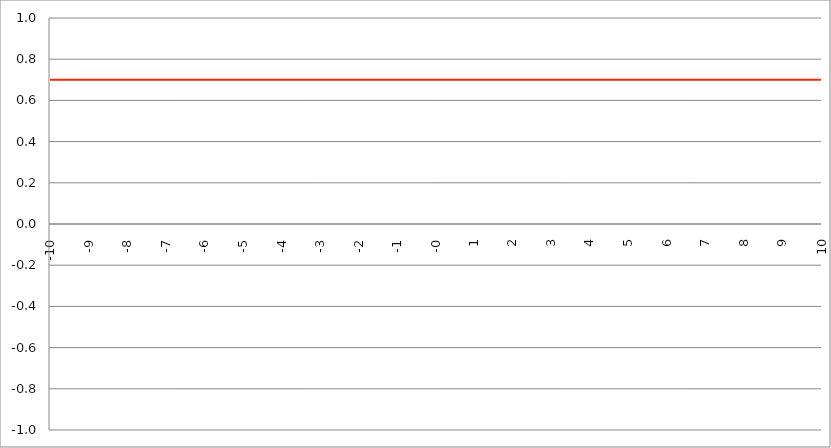
| Category | Series 1 |
|---|---|
| -10.0 | 0.7 |
| -9.99 | 0.7 |
| -9.98 | 0.7 |
| -9.97 | 0.7 |
| -9.96 | 0.7 |
| -9.95 | 0.7 |
| -9.940000000000001 | 0.7 |
| -9.930000000000001 | 0.7 |
| -9.920000000000002 | 0.7 |
| -9.91 | 0.7 |
| -9.900000000000002 | 0.7 |
| -9.890000000000002 | 0.7 |
| -9.880000000000003 | 0.7 |
| -9.870000000000003 | 0.7 |
| -9.860000000000001 | 0.7 |
| -9.850000000000003 | 0.7 |
| -9.840000000000003 | 0.7 |
| -9.830000000000004 | 0.7 |
| -9.820000000000004 | 0.7 |
| -9.810000000000004 | 0.7 |
| -9.800000000000004 | 0.7 |
| -9.790000000000004 | 0.7 |
| -9.780000000000005 | 0.7 |
| -9.770000000000005 | 0.7 |
| -9.760000000000005 | 0.7 |
| -9.750000000000005 | 0.7 |
| -9.740000000000006 | 0.7 |
| -9.730000000000006 | 0.7 |
| -9.720000000000006 | 0.7 |
| -9.710000000000006 | 0.7 |
| -9.700000000000006 | 0.7 |
| -9.690000000000007 | 0.7 |
| -9.680000000000007 | 0.7 |
| -9.670000000000007 | 0.7 |
| -9.660000000000007 | 0.7 |
| -9.650000000000007 | 0.7 |
| -9.640000000000008 | 0.7 |
| -9.630000000000008 | 0.7 |
| -9.620000000000008 | 0.7 |
| -9.610000000000008 | 0.7 |
| -9.600000000000009 | 0.7 |
| -9.590000000000009 | 0.7 |
| -9.580000000000007 | 0.7 |
| -9.57000000000001 | 0.7 |
| -9.56000000000001 | 0.7 |
| -9.55000000000001 | 0.7 |
| -9.54000000000001 | 0.7 |
| -9.53000000000001 | 0.7 |
| -9.52000000000001 | 0.7 |
| -9.51000000000001 | 0.7 |
| -9.50000000000001 | 0.7 |
| -9.49000000000001 | 0.7 |
| -9.48000000000001 | 0.7 |
| -9.47000000000001 | 0.7 |
| -9.46000000000001 | 0.7 |
| -9.45000000000001 | 0.7 |
| -9.44000000000001 | 0.7 |
| -9.430000000000012 | 0.7 |
| -9.420000000000012 | 0.7 |
| -9.410000000000013 | 0.7 |
| -9.400000000000013 | 0.7 |
| -9.390000000000011 | 0.7 |
| -9.380000000000013 | 0.7 |
| -9.370000000000013 | 0.7 |
| -9.360000000000014 | 0.7 |
| -9.350000000000014 | 0.7 |
| -9.340000000000014 | 0.7 |
| -9.330000000000014 | 0.7 |
| -9.320000000000014 | 0.7 |
| -9.310000000000015 | 0.7 |
| -9.300000000000013 | 0.7 |
| -9.290000000000015 | 0.7 |
| -9.280000000000015 | 0.7 |
| -9.270000000000016 | 0.7 |
| -9.260000000000016 | 0.7 |
| -9.250000000000014 | 0.7 |
| -9.240000000000016 | 0.7 |
| -9.230000000000016 | 0.7 |
| -9.220000000000017 | 0.7 |
| -9.210000000000017 | 0.7 |
| -9.200000000000017 | 0.7 |
| -9.190000000000017 | 0.7 |
| -9.180000000000017 | 0.7 |
| -9.170000000000018 | 0.7 |
| -9.160000000000016 | 0.7 |
| -9.150000000000018 | 0.7 |
| -9.140000000000018 | 0.7 |
| -9.130000000000019 | 0.7 |
| -9.120000000000019 | 0.7 |
| -9.110000000000017 | 0.7 |
| -9.10000000000002 | 0.7 |
| -9.09000000000002 | 0.7 |
| -9.08000000000002 | 0.7 |
| -9.07000000000002 | 0.7 |
| -9.06000000000002 | 0.7 |
| -9.05000000000002 | 0.7 |
| -9.04000000000002 | 0.7 |
| -9.03000000000002 | 0.7 |
| -9.020000000000021 | 0.7 |
| -9.010000000000021 | 0.7 |
| -9.000000000000021 | 0.7 |
| -8.990000000000022 | 0.7 |
| -8.980000000000022 | 0.7 |
| -8.97000000000002 | 0.7 |
| -8.960000000000022 | 0.7 |
| -8.950000000000022 | 0.7 |
| -8.940000000000023 | 0.7 |
| -8.930000000000023 | 0.7 |
| -8.920000000000023 | 0.7 |
| -8.910000000000023 | 0.7 |
| -8.900000000000023 | 0.7 |
| -8.890000000000024 | 0.7 |
| -8.880000000000024 | 0.7 |
| -8.870000000000024 | 0.7 |
| -8.860000000000024 | 0.7 |
| -8.850000000000025 | 0.7 |
| -8.840000000000025 | 0.7 |
| -8.830000000000025 | 0.7 |
| -8.820000000000025 | 0.7 |
| -8.810000000000025 | 0.7 |
| -8.800000000000026 | 0.7 |
| -8.790000000000026 | 0.7 |
| -8.780000000000026 | 0.7 |
| -8.770000000000026 | 0.7 |
| -8.760000000000026 | 0.7 |
| -8.750000000000027 | 0.7 |
| -8.740000000000027 | 0.7 |
| -8.730000000000027 | 0.7 |
| -8.720000000000027 | 0.7 |
| -8.710000000000027 | 0.7 |
| -8.700000000000028 | 0.7 |
| -8.690000000000028 | 0.7 |
| -8.680000000000028 | 0.7 |
| -8.670000000000028 | 0.7 |
| -8.660000000000029 | 0.7 |
| -8.650000000000029 | 0.7 |
| -8.640000000000029 | 0.7 |
| -8.63000000000003 | 0.7 |
| -8.62000000000003 | 0.7 |
| -8.61000000000003 | 0.7 |
| -8.60000000000003 | 0.7 |
| -8.59000000000003 | 0.7 |
| -8.58000000000003 | 0.7 |
| -8.57000000000003 | 0.7 |
| -8.56000000000003 | 0.7 |
| -8.55000000000003 | 0.7 |
| -8.540000000000031 | 0.7 |
| -8.530000000000031 | 0.7 |
| -8.520000000000032 | 0.7 |
| -8.510000000000032 | 0.7 |
| -8.50000000000003 | 0.7 |
| -8.490000000000032 | 0.7 |
| -8.480000000000032 | 0.7 |
| -8.470000000000033 | 0.7 |
| -8.460000000000033 | 0.7 |
| -8.450000000000033 | 0.7 |
| -8.440000000000033 | 0.7 |
| -8.430000000000033 | 0.7 |
| -8.420000000000034 | 0.7 |
| -8.410000000000032 | 0.7 |
| -8.400000000000034 | 0.7 |
| -8.390000000000034 | 0.7 |
| -8.380000000000035 | 0.7 |
| -8.370000000000035 | 0.7 |
| -8.360000000000033 | 0.7 |
| -8.350000000000035 | 0.7 |
| -8.340000000000035 | 0.7 |
| -8.330000000000036 | 0.7 |
| -8.320000000000036 | 0.7 |
| -8.310000000000034 | 0.7 |
| -8.300000000000036 | 0.7 |
| -8.290000000000036 | 0.7 |
| -8.280000000000037 | 0.7 |
| -8.270000000000037 | 0.7 |
| -8.260000000000037 | 0.7 |
| -8.250000000000037 | 0.7 |
| -8.240000000000038 | 0.7 |
| -8.230000000000038 | 0.7 |
| -8.220000000000038 | 0.7 |
| -8.210000000000038 | 0.7 |
| -8.200000000000038 | 0.7 |
| -8.190000000000039 | 0.7 |
| -8.180000000000039 | 0.7 |
| -8.170000000000037 | 0.7 |
| -8.16000000000004 | 0.7 |
| -8.15000000000004 | 0.7 |
| -8.14000000000004 | 0.7 |
| -8.13000000000004 | 0.7 |
| -8.12000000000004 | 0.7 |
| -8.11000000000004 | 0.7 |
| -8.10000000000004 | 0.7 |
| -8.09000000000004 | 0.7 |
| -8.08000000000004 | 0.7 |
| -8.07000000000004 | 0.7 |
| -8.06000000000004 | 0.7 |
| -8.05000000000004 | 0.7 |
| -8.040000000000042 | 0.7 |
| -8.03000000000004 | 0.7 |
| -8.020000000000042 | 0.7 |
| -8.010000000000042 | 0.7 |
| -8.000000000000043 | 0.7 |
| -7.990000000000043 | 0.7 |
| -7.980000000000043 | 0.7 |
| -7.970000000000043 | 0.7 |
| -7.960000000000043 | 0.7 |
| -7.950000000000044 | 0.7 |
| -7.940000000000044 | 0.7 |
| -7.930000000000044 | 0.7 |
| -7.920000000000044 | 0.7 |
| -7.910000000000044 | 0.7 |
| -7.900000000000044 | 0.7 |
| -7.890000000000045 | 0.7 |
| -7.880000000000045 | 0.7 |
| -7.870000000000045 | 0.7 |
| -7.860000000000046 | 0.7 |
| -7.850000000000046 | 0.7 |
| -7.840000000000046 | 0.7 |
| -7.830000000000046 | 0.7 |
| -7.820000000000046 | 0.7 |
| -7.810000000000047 | 0.7 |
| -7.800000000000047 | 0.7 |
| -7.790000000000047 | 0.7 |
| -7.780000000000047 | 0.7 |
| -7.770000000000047 | 0.7 |
| -7.760000000000048 | 0.7 |
| -7.750000000000048 | 0.7 |
| -7.740000000000048 | 0.7 |
| -7.730000000000048 | 0.7 |
| -7.720000000000049 | 0.7 |
| -7.710000000000049 | 0.7 |
| -7.700000000000049 | 0.7 |
| -7.690000000000049 | 0.7 |
| -7.680000000000049 | 0.7 |
| -7.67000000000005 | 0.7 |
| -7.66000000000005 | 0.7 |
| -7.65000000000005 | 0.7 |
| -7.64000000000005 | 0.7 |
| -7.63000000000005 | 0.7 |
| -7.620000000000051 | 0.7 |
| -7.610000000000051 | 0.7 |
| -7.600000000000051 | 0.7 |
| -7.590000000000051 | 0.7 |
| -7.580000000000052 | 0.7 |
| -7.570000000000052 | 0.7 |
| -7.560000000000052 | 0.7 |
| -7.550000000000052 | 0.7 |
| -7.540000000000052 | 0.7 |
| -7.530000000000053 | 0.7 |
| -7.520000000000053 | 0.7 |
| -7.510000000000053 | 0.7 |
| -7.500000000000053 | 0.7 |
| -7.490000000000053 | 0.7 |
| -7.480000000000054 | 0.7 |
| -7.470000000000054 | 0.7 |
| -7.460000000000054 | 0.7 |
| -7.450000000000054 | 0.7 |
| -7.440000000000054 | 0.7 |
| -7.430000000000054 | 0.7 |
| -7.420000000000055 | 0.7 |
| -7.410000000000055 | 0.7 |
| -7.400000000000055 | 0.7 |
| -7.390000000000056 | 0.7 |
| -7.380000000000056 | 0.7 |
| -7.370000000000056 | 0.7 |
| -7.360000000000056 | 0.7 |
| -7.350000000000056 | 0.7 |
| -7.340000000000057 | 0.7 |
| -7.330000000000057 | 0.7 |
| -7.320000000000057 | 0.7 |
| -7.310000000000057 | 0.7 |
| -7.300000000000058 | 0.7 |
| -7.290000000000058 | 0.7 |
| -7.280000000000058 | 0.7 |
| -7.270000000000058 | 0.7 |
| -7.260000000000058 | 0.7 |
| -7.250000000000059 | 0.7 |
| -7.240000000000059 | 0.7 |
| -7.23000000000006 | 0.7 |
| -7.220000000000059 | 0.7 |
| -7.210000000000059 | 0.7 |
| -7.20000000000006 | 0.7 |
| -7.19000000000006 | 0.7 |
| -7.18000000000006 | 0.7 |
| -7.17000000000006 | 0.7 |
| -7.160000000000061 | 0.7 |
| -7.150000000000061 | 0.7 |
| -7.140000000000061 | 0.7 |
| -7.130000000000061 | 0.7 |
| -7.120000000000061 | 0.7 |
| -7.110000000000062 | 0.7 |
| -7.100000000000062 | 0.7 |
| -7.090000000000062 | 0.7 |
| -7.080000000000062 | 0.7 |
| -7.070000000000062 | 0.7 |
| -7.060000000000063 | 0.7 |
| -7.050000000000063 | 0.7 |
| -7.040000000000063 | 0.7 |
| -7.030000000000063 | 0.7 |
| -7.020000000000064 | 0.7 |
| -7.010000000000064 | 0.7 |
| -7.000000000000064 | 0.7 |
| -6.990000000000064 | 0.7 |
| -6.980000000000064 | 0.7 |
| -6.970000000000064 | 0.7 |
| -6.960000000000064 | 0.7 |
| -6.950000000000064 | 0.7 |
| -6.940000000000065 | 0.7 |
| -6.930000000000065 | 0.7 |
| -6.920000000000065 | 0.7 |
| -6.910000000000065 | 0.7 |
| -6.900000000000066 | 0.7 |
| -6.890000000000066 | 0.7 |
| -6.880000000000066 | 0.7 |
| -6.870000000000066 | 0.7 |
| -6.860000000000067 | 0.7 |
| -6.850000000000067 | 0.7 |
| -6.840000000000067 | 0.7 |
| -6.830000000000067 | 0.7 |
| -6.820000000000068 | 0.7 |
| -6.810000000000068 | 0.7 |
| -6.800000000000068 | 0.7 |
| -6.790000000000068 | 0.7 |
| -6.780000000000068 | 0.7 |
| -6.770000000000068 | 0.7 |
| -6.760000000000069 | 0.7 |
| -6.75000000000007 | 0.7 |
| -6.74000000000007 | 0.7 |
| -6.73000000000007 | 0.7 |
| -6.72000000000007 | 0.7 |
| -6.71000000000007 | 0.7 |
| -6.70000000000007 | 0.7 |
| -6.69000000000007 | 0.7 |
| -6.680000000000071 | 0.7 |
| -6.670000000000071 | 0.7 |
| -6.660000000000071 | 0.7 |
| -6.650000000000071 | 0.7 |
| -6.640000000000072 | 0.7 |
| -6.630000000000072 | 0.7 |
| -6.620000000000072 | 0.7 |
| -6.610000000000072 | 0.7 |
| -6.600000000000072 | 0.7 |
| -6.590000000000073 | 0.7 |
| -6.580000000000073 | 0.7 |
| -6.570000000000073 | 0.7 |
| -6.560000000000073 | 0.7 |
| -6.550000000000074 | 0.7 |
| -6.540000000000074 | 0.7 |
| -6.530000000000074 | 0.7 |
| -6.520000000000074 | 0.7 |
| -6.510000000000074 | 0.7 |
| -6.500000000000074 | 0.7 |
| -6.490000000000074 | 0.7 |
| -6.480000000000074 | 0.7 |
| -6.470000000000075 | 0.7 |
| -6.460000000000075 | 0.7 |
| -6.450000000000075 | 0.7 |
| -6.440000000000075 | 0.7 |
| -6.430000000000076 | 0.7 |
| -6.420000000000076 | 0.7 |
| -6.410000000000076 | 0.7 |
| -6.400000000000076 | 0.7 |
| -6.390000000000077 | 0.7 |
| -6.380000000000077 | 0.7 |
| -6.370000000000077 | 0.7 |
| -6.360000000000078 | 0.7 |
| -6.350000000000078 | 0.7 |
| -6.340000000000078 | 0.7 |
| -6.330000000000078 | 0.7 |
| -6.320000000000078 | 0.7 |
| -6.310000000000079 | 0.7 |
| -6.300000000000079 | 0.7 |
| -6.29000000000008 | 0.7 |
| -6.28000000000008 | 0.7 |
| -6.27000000000008 | 0.7 |
| -6.26000000000008 | 0.7 |
| -6.25000000000008 | 0.7 |
| -6.24000000000008 | 0.7 |
| -6.23000000000008 | 0.7 |
| -6.220000000000081 | 0.7 |
| -6.210000000000081 | 0.7 |
| -6.200000000000081 | 0.7 |
| -6.190000000000081 | 0.7 |
| -6.180000000000081 | 0.7 |
| -6.170000000000082 | 0.7 |
| -6.160000000000082 | 0.7 |
| -6.150000000000082 | 0.7 |
| -6.140000000000082 | 0.7 |
| -6.130000000000082 | 0.7 |
| -6.120000000000083 | 0.7 |
| -6.110000000000083 | 0.7 |
| -6.100000000000083 | 0.7 |
| -6.090000000000083 | 0.7 |
| -6.080000000000084 | 0.7 |
| -6.070000000000084 | 0.7 |
| -6.060000000000084 | 0.7 |
| -6.050000000000084 | 0.7 |
| -6.040000000000084 | 0.7 |
| -6.030000000000084 | 0.7 |
| -6.020000000000085 | 0.7 |
| -6.010000000000085 | 0.7 |
| -6.000000000000085 | 0.7 |
| -5.990000000000085 | 0.7 |
| -5.980000000000085 | 0.7 |
| -5.970000000000085 | 0.7 |
| -5.960000000000086 | 0.7 |
| -5.950000000000086 | 0.7 |
| -5.940000000000086 | 0.7 |
| -5.930000000000086 | 0.7 |
| -5.920000000000087 | 0.7 |
| -5.910000000000087 | 0.7 |
| -5.900000000000087 | 0.7 |
| -5.890000000000088 | 0.7 |
| -5.880000000000088 | 0.7 |
| -5.870000000000088 | 0.7 |
| -5.860000000000088 | 0.7 |
| -5.850000000000088 | 0.7 |
| -5.840000000000089 | 0.7 |
| -5.830000000000089 | 0.7 |
| -5.820000000000089 | 0.7 |
| -5.810000000000089 | 0.7 |
| -5.800000000000089 | 0.7 |
| -5.79000000000009 | 0.7 |
| -5.78000000000009 | 0.7 |
| -5.77000000000009 | 0.7 |
| -5.76000000000009 | 0.7 |
| -5.750000000000091 | 0.7 |
| -5.740000000000091 | 0.7 |
| -5.730000000000091 | 0.7 |
| -5.720000000000091 | 0.7 |
| -5.710000000000091 | 0.7 |
| -5.700000000000092 | 0.7 |
| -5.690000000000092 | 0.7 |
| -5.680000000000092 | 0.7 |
| -5.670000000000092 | 0.7 |
| -5.660000000000092 | 0.7 |
| -5.650000000000093 | 0.7 |
| -5.640000000000093 | 0.7 |
| -5.630000000000093 | 0.7 |
| -5.620000000000093 | 0.7 |
| -5.610000000000093 | 0.7 |
| -5.600000000000094 | 0.7 |
| -5.590000000000094 | 0.7 |
| -5.580000000000094 | 0.7 |
| -5.570000000000094 | 0.7 |
| -5.560000000000095 | 0.7 |
| -5.550000000000095 | 0.7 |
| -5.540000000000095 | 0.7 |
| -5.530000000000095 | 0.7 |
| -5.520000000000095 | 0.7 |
| -5.510000000000096 | 0.7 |
| -5.500000000000096 | 0.7 |
| -5.490000000000096 | 0.7 |
| -5.480000000000096 | 0.7 |
| -5.470000000000096 | 0.7 |
| -5.460000000000097 | 0.7 |
| -5.450000000000097 | 0.7 |
| -5.440000000000097 | 0.7 |
| -5.430000000000097 | 0.7 |
| -5.420000000000098 | 0.7 |
| -5.410000000000098 | 0.7 |
| -5.400000000000098 | 0.7 |
| -5.390000000000098 | 0.7 |
| -5.380000000000098 | 0.7 |
| -5.370000000000099 | 0.7 |
| -5.360000000000099 | 0.7 |
| -5.350000000000099 | 0.7 |
| -5.340000000000099 | 0.7 |
| -5.330000000000099 | 0.7 |
| -5.3200000000001 | 0.7 |
| -5.3100000000001 | 0.7 |
| -5.3000000000001 | 0.7 |
| -5.2900000000001 | 0.7 |
| -5.2800000000001 | 0.7 |
| -5.2700000000001 | 0.7 |
| -5.260000000000101 | 0.7 |
| -5.250000000000101 | 0.7 |
| -5.240000000000101 | 0.7 |
| -5.230000000000101 | 0.7 |
| -5.220000000000102 | 0.7 |
| -5.210000000000102 | 0.7 |
| -5.200000000000102 | 0.7 |
| -5.190000000000103 | 0.7 |
| -5.180000000000103 | 0.7 |
| -5.170000000000103 | 0.7 |
| -5.160000000000103 | 0.7 |
| -5.150000000000103 | 0.7 |
| -5.140000000000104 | 0.7 |
| -5.130000000000104 | 0.7 |
| -5.120000000000104 | 0.7 |
| -5.110000000000104 | 0.7 |
| -5.100000000000104 | 0.7 |
| -5.090000000000104 | 0.7 |
| -5.080000000000104 | 0.7 |
| -5.070000000000105 | 0.7 |
| -5.060000000000105 | 0.7 |
| -5.050000000000105 | 0.7 |
| -5.040000000000105 | 0.7 |
| -5.030000000000105 | 0.7 |
| -5.020000000000106 | 0.7 |
| -5.010000000000106 | 0.7 |
| -5.000000000000106 | 0.7 |
| -4.990000000000106 | 0.7 |
| -4.980000000000106 | 0.7 |
| -4.970000000000107 | 0.7 |
| -4.960000000000107 | 0.7 |
| -4.950000000000107 | 0.7 |
| -4.940000000000107 | 0.7 |
| -4.930000000000108 | 0.7 |
| -4.920000000000108 | 0.7 |
| -4.910000000000108 | 0.7 |
| -4.900000000000108 | 0.7 |
| -4.890000000000109 | 0.7 |
| -4.88000000000011 | 0.7 |
| -4.87000000000011 | 0.7 |
| -4.86000000000011 | 0.7 |
| -4.85000000000011 | 0.7 |
| -4.84000000000011 | 0.7 |
| -4.83000000000011 | 0.7 |
| -4.82000000000011 | 0.7 |
| -4.810000000000111 | 0.7 |
| -4.800000000000111 | 0.7 |
| -4.790000000000111 | 0.7 |
| -4.780000000000111 | 0.7 |
| -4.770000000000111 | 0.7 |
| -4.760000000000112 | 0.7 |
| -4.750000000000112 | 0.7 |
| -4.740000000000112 | 0.7 |
| -4.730000000000112 | 0.7 |
| -4.720000000000112 | 0.7 |
| -4.710000000000113 | 0.7 |
| -4.700000000000113 | 0.7 |
| -4.690000000000113 | 0.7 |
| -4.680000000000113 | 0.7 |
| -4.670000000000114 | 0.7 |
| -4.660000000000114 | 0.7 |
| -4.650000000000114 | 0.7 |
| -4.640000000000114 | 0.7 |
| -4.630000000000114 | 0.7 |
| -4.620000000000115 | 0.7 |
| -4.610000000000115 | 0.7 |
| -4.600000000000115 | 0.7 |
| -4.590000000000115 | 0.7 |
| -4.580000000000115 | 0.7 |
| -4.570000000000115 | 0.7 |
| -4.560000000000116 | 0.7 |
| -4.550000000000116 | 0.7 |
| -4.540000000000116 | 0.7 |
| -4.530000000000116 | 0.7 |
| -4.520000000000117 | 0.7 |
| -4.510000000000117 | 0.7 |
| -4.500000000000117 | 0.7 |
| -4.490000000000117 | 0.7 |
| -4.480000000000117 | 0.7 |
| -4.470000000000117 | 0.7 |
| -4.460000000000118 | 0.7 |
| -4.450000000000118 | 0.7 |
| -4.440000000000118 | 0.7 |
| -4.430000000000118 | 0.7 |
| -4.420000000000119 | 0.7 |
| -4.41000000000012 | 0.7 |
| -4.40000000000012 | 0.7 |
| -4.39000000000012 | 0.7 |
| -4.38000000000012 | 0.7 |
| -4.37000000000012 | 0.7 |
| -4.36000000000012 | 0.7 |
| -4.35000000000012 | 0.7 |
| -4.34000000000012 | 0.7 |
| -4.33000000000012 | 0.7 |
| -4.320000000000121 | 0.7 |
| -4.310000000000121 | 0.7 |
| -4.300000000000121 | 0.7 |
| -4.290000000000121 | 0.7 |
| -4.280000000000121 | 0.7 |
| -4.270000000000122 | 0.7 |
| -4.260000000000122 | 0.7 |
| -4.250000000000122 | 0.7 |
| -4.240000000000122 | 0.7 |
| -4.230000000000122 | 0.7 |
| -4.220000000000123 | 0.7 |
| -4.210000000000123 | 0.7 |
| -4.200000000000123 | 0.7 |
| -4.190000000000124 | 0.7 |
| -4.180000000000124 | 0.7 |
| -4.170000000000124 | 0.7 |
| -4.160000000000124 | 0.7 |
| -4.150000000000124 | 0.7 |
| -4.140000000000124 | 0.7 |
| -4.130000000000125 | 0.7 |
| -4.120000000000125 | 0.7 |
| -4.110000000000125 | 0.7 |
| -4.100000000000125 | 0.7 |
| -4.090000000000125 | 0.7 |
| -4.080000000000126 | 0.7 |
| -4.070000000000126 | 0.7 |
| -4.060000000000126 | 0.7 |
| -4.050000000000126 | 0.7 |
| -4.040000000000127 | 0.7 |
| -4.030000000000127 | 0.7 |
| -4.020000000000127 | 0.7 |
| -4.010000000000127 | 0.7 |
| -4.000000000000127 | 0.7 |
| -3.990000000000128 | 0.7 |
| -3.980000000000128 | 0.7 |
| -3.970000000000129 | 0.7 |
| -3.960000000000129 | 0.7 |
| -3.950000000000129 | 0.7 |
| -3.940000000000129 | 0.7 |
| -3.930000000000129 | 0.7 |
| -3.92000000000013 | 0.7 |
| -3.91000000000013 | 0.7 |
| -3.90000000000013 | 0.7 |
| -3.89000000000013 | 0.7 |
| -3.88000000000013 | 0.7 |
| -3.870000000000131 | 0.7 |
| -3.860000000000131 | 0.7 |
| -3.850000000000131 | 0.7 |
| -3.840000000000131 | 0.7 |
| -3.830000000000131 | 0.7 |
| -3.820000000000132 | 0.7 |
| -3.810000000000132 | 0.7 |
| -3.800000000000132 | 0.7 |
| -3.790000000000132 | 0.7 |
| -3.780000000000132 | 0.7 |
| -3.770000000000133 | 0.7 |
| -3.760000000000133 | 0.7 |
| -3.750000000000133 | 0.7 |
| -3.740000000000133 | 0.7 |
| -3.730000000000134 | 0.7 |
| -3.720000000000134 | 0.7 |
| -3.710000000000134 | 0.7 |
| -3.700000000000134 | 0.7 |
| -3.690000000000134 | 0.7 |
| -3.680000000000135 | 0.7 |
| -3.670000000000135 | 0.7 |
| -3.660000000000135 | 0.7 |
| -3.650000000000135 | 0.7 |
| -3.640000000000135 | 0.7 |
| -3.630000000000136 | 0.7 |
| -3.620000000000136 | 0.7 |
| -3.610000000000136 | 0.7 |
| -3.600000000000136 | 0.7 |
| -3.590000000000137 | 0.7 |
| -3.580000000000137 | 0.7 |
| -3.570000000000137 | 0.7 |
| -3.560000000000137 | 0.7 |
| -3.550000000000137 | 0.7 |
| -3.540000000000138 | 0.7 |
| -3.530000000000138 | 0.7 |
| -3.520000000000138 | 0.7 |
| -3.510000000000138 | 0.7 |
| -3.500000000000139 | 0.7 |
| -3.490000000000139 | 0.7 |
| -3.480000000000139 | 0.7 |
| -3.470000000000139 | 0.7 |
| -3.460000000000139 | 0.7 |
| -3.45000000000014 | 0.7 |
| -3.44000000000014 | 0.7 |
| -3.43000000000014 | 0.7 |
| -3.42000000000014 | 0.7 |
| -3.41000000000014 | 0.7 |
| -3.400000000000141 | 0.7 |
| -3.390000000000141 | 0.7 |
| -3.380000000000141 | 0.7 |
| -3.370000000000141 | 0.7 |
| -3.360000000000141 | 0.7 |
| -3.350000000000142 | 0.7 |
| -3.340000000000142 | 0.7 |
| -3.330000000000142 | 0.7 |
| -3.320000000000142 | 0.7 |
| -3.310000000000143 | 0.7 |
| -3.300000000000143 | 0.7 |
| -3.290000000000143 | 0.7 |
| -3.280000000000143 | 0.7 |
| -3.270000000000143 | 0.7 |
| -3.260000000000144 | 0.7 |
| -3.250000000000144 | 0.7 |
| -3.240000000000144 | 0.7 |
| -3.230000000000144 | 0.7 |
| -3.220000000000145 | 0.7 |
| -3.210000000000145 | 0.7 |
| -3.200000000000145 | 0.7 |
| -3.190000000000145 | 0.7 |
| -3.180000000000145 | 0.7 |
| -3.170000000000146 | 0.7 |
| -3.160000000000146 | 0.7 |
| -3.150000000000146 | 0.7 |
| -3.140000000000146 | 0.7 |
| -3.130000000000146 | 0.7 |
| -3.120000000000147 | 0.7 |
| -3.110000000000147 | 0.7 |
| -3.100000000000147 | 0.7 |
| -3.090000000000147 | 0.7 |
| -3.080000000000147 | 0.7 |
| -3.070000000000148 | 0.7 |
| -3.060000000000148 | 0.7 |
| -3.050000000000148 | 0.7 |
| -3.040000000000148 | 0.7 |
| -3.030000000000149 | 0.7 |
| -3.020000000000149 | 0.7 |
| -3.010000000000149 | 0.7 |
| -3.000000000000149 | 0.7 |
| -2.990000000000149 | 0.7 |
| -2.98000000000015 | 0.7 |
| -2.97000000000015 | 0.7 |
| -2.96000000000015 | 0.7 |
| -2.95000000000015 | 0.7 |
| -2.94000000000015 | 0.7 |
| -2.930000000000151 | 0.7 |
| -2.920000000000151 | 0.7 |
| -2.910000000000151 | 0.7 |
| -2.900000000000151 | 0.7 |
| -2.890000000000151 | 0.7 |
| -2.880000000000152 | 0.7 |
| -2.870000000000152 | 0.7 |
| -2.860000000000152 | 0.7 |
| -2.850000000000152 | 0.7 |
| -2.840000000000153 | 0.7 |
| -2.830000000000153 | 0.7 |
| -2.820000000000153 | 0.7 |
| -2.810000000000153 | 0.7 |
| -2.800000000000153 | 0.7 |
| -2.790000000000154 | 0.7 |
| -2.780000000000154 | 0.7 |
| -2.770000000000154 | 0.7 |
| -2.760000000000154 | 0.7 |
| -2.750000000000154 | 0.7 |
| -2.740000000000155 | 0.7 |
| -2.730000000000155 | 0.7 |
| -2.720000000000155 | 0.7 |
| -2.710000000000155 | 0.7 |
| -2.700000000000156 | 0.7 |
| -2.690000000000156 | 0.7 |
| -2.680000000000156 | 0.7 |
| -2.670000000000156 | 0.7 |
| -2.660000000000156 | 0.7 |
| -2.650000000000157 | 0.7 |
| -2.640000000000157 | 0.7 |
| -2.630000000000157 | 0.7 |
| -2.620000000000157 | 0.7 |
| -2.610000000000157 | 0.7 |
| -2.600000000000158 | 0.7 |
| -2.590000000000158 | 0.7 |
| -2.580000000000158 | 0.7 |
| -2.570000000000158 | 0.7 |
| -2.560000000000159 | 0.7 |
| -2.550000000000159 | 0.7 |
| -2.54000000000016 | 0.7 |
| -2.530000000000159 | 0.7 |
| -2.520000000000159 | 0.7 |
| -2.51000000000016 | 0.7 |
| -2.50000000000016 | 0.7 |
| -2.49000000000016 | 0.7 |
| -2.48000000000016 | 0.7 |
| -2.47000000000016 | 0.7 |
| -2.460000000000161 | 0.7 |
| -2.450000000000161 | 0.7 |
| -2.440000000000161 | 0.7 |
| -2.430000000000161 | 0.7 |
| -2.420000000000162 | 0.7 |
| -2.410000000000162 | 0.7 |
| -2.400000000000162 | 0.7 |
| -2.390000000000162 | 0.7 |
| -2.380000000000162 | 0.7 |
| -2.370000000000163 | 0.7 |
| -2.360000000000163 | 0.7 |
| -2.350000000000163 | 0.7 |
| -2.340000000000163 | 0.7 |
| -2.330000000000163 | 0.7 |
| -2.320000000000164 | 0.7 |
| -2.310000000000164 | 0.7 |
| -2.300000000000164 | 0.7 |
| -2.290000000000164 | 0.7 |
| -2.280000000000165 | 0.7 |
| -2.270000000000165 | 0.7 |
| -2.260000000000165 | 0.7 |
| -2.250000000000165 | 0.7 |
| -2.240000000000165 | 0.7 |
| -2.230000000000166 | 0.7 |
| -2.220000000000166 | 0.7 |
| -2.210000000000166 | 0.7 |
| -2.200000000000166 | 0.7 |
| -2.190000000000166 | 0.7 |
| -2.180000000000167 | 0.7 |
| -2.170000000000167 | 0.7 |
| -2.160000000000167 | 0.7 |
| -2.150000000000167 | 0.7 |
| -2.140000000000168 | 0.7 |
| -2.130000000000168 | 0.7 |
| -2.120000000000168 | 0.7 |
| -2.110000000000168 | 0.7 |
| -2.100000000000168 | 0.7 |
| -2.090000000000169 | 0.7 |
| -2.080000000000169 | 0.7 |
| -2.070000000000169 | 0.7 |
| -2.060000000000169 | 0.7 |
| -2.050000000000169 | 0.7 |
| -2.04000000000017 | 0.7 |
| -2.03000000000017 | 0.7 |
| -2.02000000000017 | 0.7 |
| -2.01000000000017 | 0.7 |
| -2.000000000000171 | 0.7 |
| -1.99000000000017 | 0.7 |
| -1.98000000000017 | 0.7 |
| -1.97000000000017 | 0.7 |
| -1.96000000000017 | 0.7 |
| -1.95000000000017 | 0.7 |
| -1.94000000000017 | 0.7 |
| -1.93000000000017 | 0.7 |
| -1.92000000000017 | 0.7 |
| -1.91000000000017 | 0.7 |
| -1.90000000000017 | 0.7 |
| -1.89000000000017 | 0.7 |
| -1.88000000000017 | 0.7 |
| -1.87000000000017 | 0.7 |
| -1.86000000000017 | 0.7 |
| -1.85000000000017 | 0.7 |
| -1.84000000000017 | 0.7 |
| -1.83000000000017 | 0.7 |
| -1.82000000000017 | 0.7 |
| -1.81000000000017 | 0.7 |
| -1.80000000000017 | 0.7 |
| -1.79000000000017 | 0.7 |
| -1.78000000000017 | 0.7 |
| -1.77000000000017 | 0.7 |
| -1.76000000000017 | 0.7 |
| -1.75000000000017 | 0.7 |
| -1.74000000000017 | 0.7 |
| -1.73000000000017 | 0.7 |
| -1.72000000000017 | 0.7 |
| -1.71000000000017 | 0.7 |
| -1.70000000000017 | 0.7 |
| -1.69000000000017 | 0.7 |
| -1.68000000000017 | 0.7 |
| -1.67000000000017 | 0.7 |
| -1.66000000000017 | 0.7 |
| -1.65000000000017 | 0.7 |
| -1.64000000000017 | 0.7 |
| -1.63000000000017 | 0.7 |
| -1.62000000000017 | 0.7 |
| -1.61000000000017 | 0.7 |
| -1.60000000000017 | 0.7 |
| -1.59000000000017 | 0.7 |
| -1.58000000000017 | 0.7 |
| -1.57000000000017 | 0.7 |
| -1.56000000000017 | 0.7 |
| -1.55000000000017 | 0.7 |
| -1.54000000000017 | 0.7 |
| -1.53000000000017 | 0.7 |
| -1.52000000000017 | 0.7 |
| -1.51000000000017 | 0.7 |
| -1.50000000000017 | 0.7 |
| -1.49000000000017 | 0.7 |
| -1.48000000000017 | 0.7 |
| -1.47000000000017 | 0.7 |
| -1.46000000000017 | 0.7 |
| -1.45000000000017 | 0.7 |
| -1.44000000000017 | 0.7 |
| -1.43000000000017 | 0.7 |
| -1.42000000000017 | 0.7 |
| -1.41000000000017 | 0.7 |
| -1.40000000000017 | 0.7 |
| -1.39000000000017 | 0.7 |
| -1.38000000000017 | 0.7 |
| -1.37000000000017 | 0.7 |
| -1.36000000000017 | 0.7 |
| -1.35000000000017 | 0.7 |
| -1.34000000000017 | 0.7 |
| -1.33000000000017 | 0.7 |
| -1.32000000000017 | 0.7 |
| -1.31000000000017 | 0.7 |
| -1.30000000000017 | 0.7 |
| -1.29000000000017 | 0.7 |
| -1.28000000000017 | 0.7 |
| -1.27000000000017 | 0.7 |
| -1.26000000000017 | 0.7 |
| -1.25000000000017 | 0.7 |
| -1.24000000000017 | 0.7 |
| -1.23000000000017 | 0.7 |
| -1.22000000000017 | 0.7 |
| -1.21000000000017 | 0.7 |
| -1.20000000000017 | 0.7 |
| -1.19000000000017 | 0.7 |
| -1.18000000000017 | 0.7 |
| -1.17000000000017 | 0.7 |
| -1.16000000000017 | 0.7 |
| -1.15000000000017 | 0.7 |
| -1.14000000000017 | 0.7 |
| -1.13000000000017 | 0.7 |
| -1.12000000000017 | 0.7 |
| -1.11000000000017 | 0.7 |
| -1.10000000000017 | 0.7 |
| -1.09000000000017 | 0.7 |
| -1.08000000000017 | 0.7 |
| -1.07000000000017 | 0.7 |
| -1.06000000000017 | 0.7 |
| -1.05000000000017 | 0.7 |
| -1.04000000000017 | 0.7 |
| -1.03000000000017 | 0.7 |
| -1.02000000000017 | 0.7 |
| -1.01000000000017 | 0.7 |
| -1.00000000000017 | 0.7 |
| -0.99000000000017 | 0.7 |
| -0.98000000000017 | 0.7 |
| -0.97000000000017 | 0.7 |
| -0.96000000000017 | 0.7 |
| -0.95000000000017 | 0.7 |
| -0.94000000000017 | 0.7 |
| -0.93000000000017 | 0.7 |
| -0.92000000000017 | 0.7 |
| -0.91000000000017 | 0.7 |
| -0.90000000000017 | 0.7 |
| -0.890000000000169 | 0.7 |
| -0.880000000000169 | 0.7 |
| -0.870000000000169 | 0.7 |
| -0.860000000000169 | 0.7 |
| -0.850000000000169 | 0.7 |
| -0.840000000000169 | 0.7 |
| -0.830000000000169 | 0.7 |
| -0.820000000000169 | 0.7 |
| -0.810000000000169 | 0.7 |
| -0.800000000000169 | 0.7 |
| -0.790000000000169 | 0.7 |
| -0.780000000000169 | 0.7 |
| -0.770000000000169 | 0.7 |
| -0.760000000000169 | 0.7 |
| -0.750000000000169 | 0.7 |
| -0.740000000000169 | 0.7 |
| -0.730000000000169 | 0.7 |
| -0.720000000000169 | 0.7 |
| -0.710000000000169 | 0.7 |
| -0.700000000000169 | 0.7 |
| -0.690000000000169 | 0.7 |
| -0.680000000000169 | 0.7 |
| -0.670000000000169 | 0.7 |
| -0.660000000000169 | 0.7 |
| -0.650000000000169 | 0.7 |
| -0.640000000000169 | 0.7 |
| -0.630000000000169 | 0.7 |
| -0.620000000000169 | 0.7 |
| -0.610000000000169 | 0.7 |
| -0.600000000000169 | 0.7 |
| -0.590000000000169 | 0.7 |
| -0.580000000000169 | 0.7 |
| -0.570000000000169 | 0.7 |
| -0.560000000000169 | 0.7 |
| -0.550000000000169 | 0.7 |
| -0.540000000000169 | 0.7 |
| -0.530000000000169 | 0.7 |
| -0.520000000000169 | 0.7 |
| -0.510000000000169 | 0.7 |
| -0.500000000000169 | 0.7 |
| -0.490000000000169 | 0.7 |
| -0.480000000000169 | 0.7 |
| -0.470000000000169 | 0.7 |
| -0.460000000000169 | 0.7 |
| -0.450000000000169 | 0.7 |
| -0.440000000000169 | 0.7 |
| -0.430000000000169 | 0.7 |
| -0.420000000000169 | 0.7 |
| -0.410000000000169 | 0.7 |
| -0.400000000000169 | 0.7 |
| -0.390000000000169 | 0.7 |
| -0.380000000000169 | 0.7 |
| -0.370000000000169 | 0.7 |
| -0.360000000000169 | 0.7 |
| -0.350000000000169 | 0.7 |
| -0.340000000000169 | 0.7 |
| -0.330000000000169 | 0.7 |
| -0.320000000000169 | 0.7 |
| -0.310000000000169 | 0.7 |
| -0.300000000000169 | 0.7 |
| -0.290000000000169 | 0.7 |
| -0.280000000000169 | 0.7 |
| -0.270000000000169 | 0.7 |
| -0.260000000000169 | 0.7 |
| -0.250000000000169 | 0.7 |
| -0.240000000000169 | 0.7 |
| -0.230000000000169 | 0.7 |
| -0.220000000000169 | 0.7 |
| -0.210000000000169 | 0.7 |
| -0.200000000000169 | 0.7 |
| -0.190000000000169 | 0.7 |
| -0.180000000000169 | 0.7 |
| -0.170000000000169 | 0.7 |
| -0.160000000000169 | 0.7 |
| -0.150000000000169 | 0.7 |
| -0.140000000000169 | 0.7 |
| -0.130000000000169 | 0.7 |
| -0.120000000000169 | 0.7 |
| -0.110000000000169 | 0.7 |
| -0.100000000000169 | 0.7 |
| -0.0900000000001689 | 0.7 |
| -0.0800000000001689 | 0.7 |
| -0.0700000000001689 | 0.7 |
| -0.0600000000001689 | 0.7 |
| -0.0500000000001689 | 0.7 |
| -0.0400000000001689 | 0.7 |
| -0.0300000000001689 | 0.7 |
| -0.0200000000001689 | 0.7 |
| -0.0100000000001689 | 0.7 |
| -1.6888920817415e-13 | 0.7 |
| 0.00999999999983111 | 0.7 |
| 0.0199999999998311 | 0.7 |
| 0.0299999999998311 | 0.7 |
| 0.0399999999998311 | 0.7 |
| 0.0499999999998311 | 0.7 |
| 0.0599999999998311 | 0.7 |
| 0.0699999999998311 | 0.7 |
| 0.0799999999998311 | 0.7 |
| 0.0899999999998311 | 0.7 |
| 0.0999999999998311 | 0.7 |
| 0.109999999999831 | 0.7 |
| 0.119999999999831 | 0.7 |
| 0.129999999999831 | 0.7 |
| 0.139999999999831 | 0.7 |
| 0.149999999999831 | 0.7 |
| 0.159999999999831 | 0.7 |
| 0.169999999999831 | 0.7 |
| 0.179999999999831 | 0.7 |
| 0.189999999999831 | 0.7 |
| 0.199999999999831 | 0.7 |
| 0.209999999999831 | 0.7 |
| 0.219999999999831 | 0.7 |
| 0.229999999999831 | 0.7 |
| 0.239999999999831 | 0.7 |
| 0.249999999999831 | 0.7 |
| 0.259999999999831 | 0.7 |
| 0.269999999999831 | 0.7 |
| 0.279999999999831 | 0.7 |
| 0.289999999999831 | 0.7 |
| 0.299999999999831 | 0.7 |
| 0.309999999999831 | 0.7 |
| 0.319999999999831 | 0.7 |
| 0.329999999999831 | 0.7 |
| 0.339999999999831 | 0.7 |
| 0.349999999999831 | 0.7 |
| 0.359999999999831 | 0.7 |
| 0.369999999999831 | 0.7 |
| 0.379999999999831 | 0.7 |
| 0.389999999999831 | 0.7 |
| 0.399999999999831 | 0.7 |
| 0.409999999999831 | 0.7 |
| 0.419999999999831 | 0.7 |
| 0.429999999999831 | 0.7 |
| 0.439999999999831 | 0.7 |
| 0.449999999999831 | 0.7 |
| 0.459999999999831 | 0.7 |
| 0.469999999999831 | 0.7 |
| 0.479999999999831 | 0.7 |
| 0.489999999999831 | 0.7 |
| 0.499999999999831 | 0.7 |
| 0.509999999999831 | 0.7 |
| 0.519999999999831 | 0.7 |
| 0.529999999999831 | 0.7 |
| 0.539999999999831 | 0.7 |
| 0.549999999999831 | 0.7 |
| 0.559999999999831 | 0.7 |
| 0.569999999999831 | 0.7 |
| 0.579999999999831 | 0.7 |
| 0.589999999999831 | 0.7 |
| 0.599999999999831 | 0.7 |
| 0.609999999999831 | 0.7 |
| 0.619999999999831 | 0.7 |
| 0.629999999999831 | 0.7 |
| 0.639999999999831 | 0.7 |
| 0.649999999999831 | 0.7 |
| 0.659999999999831 | 0.7 |
| 0.669999999999831 | 0.7 |
| 0.679999999999831 | 0.7 |
| 0.689999999999831 | 0.7 |
| 0.699999999999831 | 0.7 |
| 0.709999999999831 | 0.7 |
| 0.719999999999831 | 0.7 |
| 0.729999999999831 | 0.7 |
| 0.739999999999831 | 0.7 |
| 0.749999999999832 | 0.7 |
| 0.759999999999832 | 0.7 |
| 0.769999999999832 | 0.7 |
| 0.779999999999832 | 0.7 |
| 0.789999999999832 | 0.7 |
| 0.799999999999832 | 0.7 |
| 0.809999999999832 | 0.7 |
| 0.819999999999832 | 0.7 |
| 0.829999999999832 | 0.7 |
| 0.839999999999832 | 0.7 |
| 0.849999999999832 | 0.7 |
| 0.859999999999832 | 0.7 |
| 0.869999999999832 | 0.7 |
| 0.879999999999832 | 0.7 |
| 0.889999999999832 | 0.7 |
| 0.899999999999832 | 0.7 |
| 0.909999999999832 | 0.7 |
| 0.919999999999832 | 0.7 |
| 0.929999999999832 | 0.7 |
| 0.939999999999832 | 0.7 |
| 0.949999999999832 | 0.7 |
| 0.959999999999832 | 0.7 |
| 0.969999999999832 | 0.7 |
| 0.979999999999832 | 0.7 |
| 0.989999999999832 | 0.7 |
| 0.999999999999832 | 0.7 |
| 1.009999999999832 | 0.7 |
| 1.019999999999832 | 0.7 |
| 1.029999999999832 | 0.7 |
| 1.039999999999832 | 0.7 |
| 1.049999999999832 | 0.7 |
| 1.059999999999832 | 0.7 |
| 1.069999999999832 | 0.7 |
| 1.079999999999832 | 0.7 |
| 1.089999999999832 | 0.7 |
| 1.099999999999832 | 0.7 |
| 1.109999999999832 | 0.7 |
| 1.119999999999832 | 0.7 |
| 1.129999999999832 | 0.7 |
| 1.139999999999832 | 0.7 |
| 1.149999999999832 | 0.7 |
| 1.159999999999832 | 0.7 |
| 1.169999999999832 | 0.7 |
| 1.179999999999832 | 0.7 |
| 1.189999999999832 | 0.7 |
| 1.199999999999832 | 0.7 |
| 1.209999999999832 | 0.7 |
| 1.219999999999832 | 0.7 |
| 1.229999999999832 | 0.7 |
| 1.239999999999832 | 0.7 |
| 1.249999999999832 | 0.7 |
| 1.259999999999832 | 0.7 |
| 1.269999999999832 | 0.7 |
| 1.279999999999832 | 0.7 |
| 1.289999999999832 | 0.7 |
| 1.299999999999832 | 0.7 |
| 1.309999999999832 | 0.7 |
| 1.319999999999832 | 0.7 |
| 1.329999999999832 | 0.7 |
| 1.339999999999832 | 0.7 |
| 1.349999999999832 | 0.7 |
| 1.359999999999832 | 0.7 |
| 1.369999999999832 | 0.7 |
| 1.379999999999832 | 0.7 |
| 1.389999999999832 | 0.7 |
| 1.399999999999832 | 0.7 |
| 1.409999999999832 | 0.7 |
| 1.419999999999832 | 0.7 |
| 1.429999999999832 | 0.7 |
| 1.439999999999832 | 0.7 |
| 1.449999999999832 | 0.7 |
| 1.459999999999832 | 0.7 |
| 1.469999999999832 | 0.7 |
| 1.479999999999832 | 0.7 |
| 1.489999999999832 | 0.7 |
| 1.499999999999832 | 0.7 |
| 1.509999999999832 | 0.7 |
| 1.519999999999832 | 0.7 |
| 1.529999999999832 | 0.7 |
| 1.539999999999832 | 0.7 |
| 1.549999999999832 | 0.7 |
| 1.559999999999832 | 0.7 |
| 1.569999999999832 | 0.7 |
| 1.579999999999832 | 0.7 |
| 1.589999999999832 | 0.7 |
| 1.599999999999832 | 0.7 |
| 1.609999999999832 | 0.7 |
| 1.619999999999832 | 0.7 |
| 1.629999999999832 | 0.7 |
| 1.639999999999832 | 0.7 |
| 1.649999999999832 | 0.7 |
| 1.659999999999832 | 0.7 |
| 1.669999999999832 | 0.7 |
| 1.679999999999832 | 0.7 |
| 1.689999999999832 | 0.7 |
| 1.699999999999832 | 0.7 |
| 1.709999999999832 | 0.7 |
| 1.719999999999832 | 0.7 |
| 1.729999999999832 | 0.7 |
| 1.739999999999832 | 0.7 |
| 1.749999999999832 | 0.7 |
| 1.759999999999832 | 0.7 |
| 1.769999999999832 | 0.7 |
| 1.779999999999832 | 0.7 |
| 1.789999999999832 | 0.7 |
| 1.799999999999832 | 0.7 |
| 1.809999999999832 | 0.7 |
| 1.819999999999832 | 0.7 |
| 1.829999999999832 | 0.7 |
| 1.839999999999832 | 0.7 |
| 1.849999999999832 | 0.7 |
| 1.859999999999832 | 0.7 |
| 1.869999999999832 | 0.7 |
| 1.879999999999832 | 0.7 |
| 1.889999999999832 | 0.7 |
| 1.899999999999832 | 0.7 |
| 1.909999999999832 | 0.7 |
| 1.919999999999832 | 0.7 |
| 1.929999999999832 | 0.7 |
| 1.939999999999832 | 0.7 |
| 1.949999999999833 | 0.7 |
| 1.959999999999833 | 0.7 |
| 1.969999999999833 | 0.7 |
| 1.979999999999833 | 0.7 |
| 1.989999999999833 | 0.7 |
| 1.999999999999833 | 0.7 |
| 2.009999999999832 | 0.7 |
| 2.019999999999832 | 0.7 |
| 2.029999999999832 | 0.7 |
| 2.039999999999832 | 0.7 |
| 2.049999999999832 | 0.7 |
| 2.059999999999831 | 0.7 |
| 2.069999999999831 | 0.7 |
| 2.079999999999831 | 0.7 |
| 2.089999999999831 | 0.7 |
| 2.09999999999983 | 0.7 |
| 2.10999999999983 | 0.7 |
| 2.11999999999983 | 0.7 |
| 2.12999999999983 | 0.7 |
| 2.13999999999983 | 0.7 |
| 2.149999999999829 | 0.7 |
| 2.159999999999829 | 0.7 |
| 2.169999999999829 | 0.7 |
| 2.179999999999829 | 0.7 |
| 2.189999999999829 | 0.7 |
| 2.199999999999828 | 0.7 |
| 2.209999999999828 | 0.7 |
| 2.219999999999828 | 0.7 |
| 2.229999999999828 | 0.7 |
| 2.239999999999827 | 0.7 |
| 2.249999999999827 | 0.7 |
| 2.259999999999827 | 0.7 |
| 2.269999999999827 | 0.7 |
| 2.279999999999827 | 0.7 |
| 2.289999999999826 | 0.7 |
| 2.299999999999826 | 0.7 |
| 2.309999999999826 | 0.7 |
| 2.319999999999826 | 0.7 |
| 2.329999999999825 | 0.7 |
| 2.339999999999825 | 0.7 |
| 2.349999999999825 | 0.7 |
| 2.359999999999825 | 0.7 |
| 2.369999999999825 | 0.7 |
| 2.379999999999824 | 0.7 |
| 2.389999999999824 | 0.7 |
| 2.399999999999824 | 0.7 |
| 2.409999999999824 | 0.7 |
| 2.419999999999824 | 0.7 |
| 2.429999999999823 | 0.7 |
| 2.439999999999823 | 0.7 |
| 2.449999999999823 | 0.7 |
| 2.459999999999823 | 0.7 |
| 2.469999999999823 | 0.7 |
| 2.479999999999822 | 0.7 |
| 2.489999999999822 | 0.7 |
| 2.499999999999822 | 0.7 |
| 2.509999999999822 | 0.7 |
| 2.519999999999821 | 0.7 |
| 2.529999999999821 | 0.7 |
| 2.539999999999821 | 0.7 |
| 2.549999999999821 | 0.7 |
| 2.559999999999821 | 0.7 |
| 2.56999999999982 | 0.7 |
| 2.57999999999982 | 0.7 |
| 2.58999999999982 | 0.7 |
| 2.59999999999982 | 0.7 |
| 2.609999999999819 | 0.7 |
| 2.619999999999819 | 0.7 |
| 2.629999999999819 | 0.7 |
| 2.639999999999819 | 0.7 |
| 2.649999999999819 | 0.7 |
| 2.659999999999818 | 0.7 |
| 2.669999999999818 | 0.7 |
| 2.679999999999818 | 0.7 |
| 2.689999999999818 | 0.7 |
| 2.699999999999818 | 0.7 |
| 2.709999999999817 | 0.7 |
| 2.719999999999817 | 0.7 |
| 2.729999999999817 | 0.7 |
| 2.739999999999817 | 0.7 |
| 2.749999999999817 | 0.7 |
| 2.759999999999816 | 0.7 |
| 2.769999999999816 | 0.7 |
| 2.779999999999816 | 0.7 |
| 2.789999999999816 | 0.7 |
| 2.799999999999815 | 0.7 |
| 2.809999999999815 | 0.7 |
| 2.819999999999815 | 0.7 |
| 2.829999999999815 | 0.7 |
| 2.839999999999815 | 0.7 |
| 2.849999999999814 | 0.7 |
| 2.859999999999814 | 0.7 |
| 2.869999999999814 | 0.7 |
| 2.879999999999814 | 0.7 |
| 2.889999999999814 | 0.7 |
| 2.899999999999813 | 0.7 |
| 2.909999999999813 | 0.7 |
| 2.919999999999813 | 0.7 |
| 2.929999999999813 | 0.7 |
| 2.939999999999813 | 0.7 |
| 2.949999999999812 | 0.7 |
| 2.959999999999812 | 0.7 |
| 2.969999999999812 | 0.7 |
| 2.979999999999812 | 0.7 |
| 2.989999999999811 | 0.7 |
| 2.999999999999811 | 0.7 |
| 3.009999999999811 | 0.7 |
| 3.019999999999811 | 0.7 |
| 3.029999999999811 | 0.7 |
| 3.03999999999981 | 0.7 |
| 3.04999999999981 | 0.7 |
| 3.05999999999981 | 0.7 |
| 3.06999999999981 | 0.7 |
| 3.07999999999981 | 0.7 |
| 3.089999999999809 | 0.7 |
| 3.099999999999809 | 0.7 |
| 3.109999999999809 | 0.7 |
| 3.119999999999809 | 0.7 |
| 3.129999999999808 | 0.7 |
| 3.139999999999808 | 0.7 |
| 3.149999999999808 | 0.7 |
| 3.159999999999808 | 0.7 |
| 3.169999999999808 | 0.7 |
| 3.179999999999807 | 0.7 |
| 3.189999999999807 | 0.7 |
| 3.199999999999807 | 0.7 |
| 3.209999999999807 | 0.7 |
| 3.219999999999807 | 0.7 |
| 3.229999999999806 | 0.7 |
| 3.239999999999806 | 0.7 |
| 3.249999999999806 | 0.7 |
| 3.259999999999806 | 0.7 |
| 3.269999999999805 | 0.7 |
| 3.279999999999805 | 0.7 |
| 3.289999999999805 | 0.7 |
| 3.299999999999805 | 0.7 |
| 3.309999999999805 | 0.7 |
| 3.319999999999804 | 0.7 |
| 3.329999999999804 | 0.7 |
| 3.339999999999804 | 0.7 |
| 3.349999999999804 | 0.7 |
| 3.359999999999804 | 0.7 |
| 3.369999999999803 | 0.7 |
| 3.379999999999803 | 0.7 |
| 3.389999999999803 | 0.7 |
| 3.399999999999803 | 0.7 |
| 3.409999999999802 | 0.7 |
| 3.419999999999802 | 0.7 |
| 3.429999999999802 | 0.7 |
| 3.439999999999802 | 0.7 |
| 3.449999999999802 | 0.7 |
| 3.459999999999801 | 0.7 |
| 3.469999999999801 | 0.7 |
| 3.479999999999801 | 0.7 |
| 3.489999999999801 | 0.7 |
| 3.499999999999801 | 0.7 |
| 3.5099999999998 | 0.7 |
| 3.5199999999998 | 0.7 |
| 3.5299999999998 | 0.7 |
| 3.5399999999998 | 0.7 |
| 3.5499999999998 | 0.7 |
| 3.559999999999799 | 0.7 |
| 3.569999999999799 | 0.7 |
| 3.579999999999799 | 0.7 |
| 3.589999999999799 | 0.7 |
| 3.599999999999798 | 0.7 |
| 3.609999999999798 | 0.7 |
| 3.619999999999798 | 0.7 |
| 3.629999999999798 | 0.7 |
| 3.639999999999798 | 0.7 |
| 3.649999999999797 | 0.7 |
| 3.659999999999797 | 0.7 |
| 3.669999999999797 | 0.7 |
| 3.679999999999797 | 0.7 |
| 3.689999999999796 | 0.7 |
| 3.699999999999796 | 0.7 |
| 3.709999999999796 | 0.7 |
| 3.719999999999796 | 0.7 |
| 3.729999999999796 | 0.7 |
| 3.739999999999795 | 0.7 |
| 3.749999999999795 | 0.7 |
| 3.759999999999795 | 0.7 |
| 3.769999999999795 | 0.7 |
| 3.779999999999795 | 0.7 |
| 3.789999999999794 | 0.7 |
| 3.799999999999794 | 0.7 |
| 3.809999999999794 | 0.7 |
| 3.819999999999794 | 0.7 |
| 3.829999999999794 | 0.7 |
| 3.839999999999793 | 0.7 |
| 3.849999999999793 | 0.7 |
| 3.859999999999793 | 0.7 |
| 3.869999999999793 | 0.7 |
| 3.879999999999792 | 0.7 |
| 3.889999999999792 | 0.7 |
| 3.899999999999792 | 0.7 |
| 3.909999999999792 | 0.7 |
| 3.919999999999792 | 0.7 |
| 3.929999999999791 | 0.7 |
| 3.939999999999791 | 0.7 |
| 3.949999999999791 | 0.7 |
| 3.959999999999791 | 0.7 |
| 3.969999999999791 | 0.7 |
| 3.97999999999979 | 0.7 |
| 3.98999999999979 | 0.7 |
| 3.99999999999979 | 0.7 |
| 4.00999999999979 | 0.7 |
| 4.01999999999979 | 0.7 |
| 4.02999999999979 | 0.7 |
| 4.03999999999979 | 0.7 |
| 4.04999999999979 | 0.7 |
| 4.05999999999979 | 0.7 |
| 4.069999999999789 | 0.7 |
| 4.079999999999788 | 0.7 |
| 4.089999999999788 | 0.7 |
| 4.099999999999788 | 0.7 |
| 4.109999999999788 | 0.7 |
| 4.119999999999788 | 0.7 |
| 4.129999999999788 | 0.7 |
| 4.139999999999787 | 0.7 |
| 4.149999999999787 | 0.7 |
| 4.159999999999787 | 0.7 |
| 4.169999999999787 | 0.7 |
| 4.179999999999786 | 0.7 |
| 4.189999999999786 | 0.7 |
| 4.199999999999786 | 0.7 |
| 4.209999999999785 | 0.7 |
| 4.219999999999785 | 0.7 |
| 4.229999999999785 | 0.7 |
| 4.239999999999785 | 0.7 |
| 4.249999999999785 | 0.7 |
| 4.259999999999784 | 0.7 |
| 4.269999999999784 | 0.7 |
| 4.279999999999784 | 0.7 |
| 4.289999999999784 | 0.7 |
| 4.299999999999784 | 0.7 |
| 4.309999999999784 | 0.7 |
| 4.319999999999784 | 0.7 |
| 4.329999999999783 | 0.7 |
| 4.339999999999783 | 0.7 |
| 4.349999999999783 | 0.7 |
| 4.359999999999783 | 0.7 |
| 4.369999999999782 | 0.7 |
| 4.379999999999782 | 0.7 |
| 4.389999999999782 | 0.7 |
| 4.399999999999782 | 0.7 |
| 4.409999999999781 | 0.7 |
| 4.419999999999781 | 0.7 |
| 4.429999999999781 | 0.7 |
| 4.43999999999978 | 0.7 |
| 4.44999999999978 | 0.7 |
| 4.45999999999978 | 0.7 |
| 4.46999999999978 | 0.7 |
| 4.47999999999978 | 0.7 |
| 4.48999999999978 | 0.7 |
| 4.49999999999978 | 0.7 |
| 4.50999999999978 | 0.7 |
| 4.51999999999978 | 0.7 |
| 4.52999999999978 | 0.7 |
| 4.539999999999778 | 0.7 |
| 4.549999999999778 | 0.7 |
| 4.559999999999778 | 0.7 |
| 4.569999999999778 | 0.7 |
| 4.579999999999778 | 0.7 |
| 4.589999999999777 | 0.7 |
| 4.599999999999777 | 0.7 |
| 4.609999999999777 | 0.7 |
| 4.619999999999777 | 0.7 |
| 4.629999999999777 | 0.7 |
| 4.639999999999776 | 0.7 |
| 4.649999999999776 | 0.7 |
| 4.659999999999776 | 0.7 |
| 4.669999999999776 | 0.7 |
| 4.679999999999775 | 0.7 |
| 4.689999999999775 | 0.7 |
| 4.699999999999775 | 0.7 |
| 4.709999999999775 | 0.7 |
| 4.719999999999774 | 0.7 |
| 4.729999999999774 | 0.7 |
| 4.739999999999774 | 0.7 |
| 4.749999999999774 | 0.7 |
| 4.759999999999774 | 0.7 |
| 4.769999999999774 | 0.7 |
| 4.779999999999773 | 0.7 |
| 4.789999999999773 | 0.7 |
| 4.799999999999773 | 0.7 |
| 4.809999999999773 | 0.7 |
| 4.819999999999773 | 0.7 |
| 4.829999999999773 | 0.7 |
| 4.839999999999772 | 0.7 |
| 4.849999999999772 | 0.7 |
| 4.859999999999772 | 0.7 |
| 4.869999999999772 | 0.7 |
| 4.879999999999771 | 0.7 |
| 4.889999999999771 | 0.7 |
| 4.899999999999771 | 0.7 |
| 4.90999999999977 | 0.7 |
| 4.91999999999977 | 0.7 |
| 4.92999999999977 | 0.7 |
| 4.93999999999977 | 0.7 |
| 4.94999999999977 | 0.7 |
| 4.95999999999977 | 0.7 |
| 4.96999999999977 | 0.7 |
| 4.97999999999977 | 0.7 |
| 4.98999999999977 | 0.7 |
| 4.99999999999977 | 0.7 |
| 5.009999999999768 | 0.7 |
| 5.019999999999768 | 0.7 |
| 5.029999999999768 | 0.7 |
| 5.039999999999768 | 0.7 |
| 5.049999999999767 | 0.7 |
| 5.059999999999767 | 0.7 |
| 5.069999999999767 | 0.7 |
| 5.079999999999767 | 0.7 |
| 5.089999999999767 | 0.7 |
| 5.099999999999766 | 0.7 |
| 5.109999999999766 | 0.7 |
| 5.119999999999766 | 0.7 |
| 5.129999999999766 | 0.7 |
| 5.139999999999766 | 0.7 |
| 5.149999999999765 | 0.7 |
| 5.159999999999765 | 0.7 |
| 5.169999999999765 | 0.7 |
| 5.179999999999765 | 0.7 |
| 5.189999999999764 | 0.7 |
| 5.199999999999764 | 0.7 |
| 5.209999999999764 | 0.7 |
| 5.219999999999764 | 0.7 |
| 5.229999999999764 | 0.7 |
| 5.239999999999763 | 0.7 |
| 5.249999999999763 | 0.7 |
| 5.259999999999763 | 0.7 |
| 5.269999999999763 | 0.7 |
| 5.279999999999763 | 0.7 |
| 5.289999999999762 | 0.7 |
| 5.299999999999762 | 0.7 |
| 5.309999999999762 | 0.7 |
| 5.319999999999762 | 0.7 |
| 5.329999999999762 | 0.7 |
| 5.339999999999761 | 0.7 |
| 5.349999999999761 | 0.7 |
| 5.359999999999761 | 0.7 |
| 5.369999999999761 | 0.7 |
| 5.37999999999976 | 0.7 |
| 5.38999999999976 | 0.7 |
| 5.39999999999976 | 0.7 |
| 5.40999999999976 | 0.7 |
| 5.41999999999976 | 0.7 |
| 5.42999999999976 | 0.7 |
| 5.43999999999976 | 0.7 |
| 5.44999999999976 | 0.7 |
| 5.45999999999976 | 0.7 |
| 5.46999999999976 | 0.7 |
| 5.479999999999758 | 0.7 |
| 5.489999999999758 | 0.7 |
| 5.499999999999758 | 0.7 |
| 5.509999999999758 | 0.7 |
| 5.519999999999758 | 0.7 |
| 5.529999999999758 | 0.7 |
| 5.539999999999757 | 0.7 |
| 5.549999999999757 | 0.7 |
| 5.559999999999757 | 0.7 |
| 5.569999999999757 | 0.7 |
| 5.579999999999756 | 0.7 |
| 5.589999999999756 | 0.7 |
| 5.599999999999756 | 0.7 |
| 5.609999999999756 | 0.7 |
| 5.619999999999756 | 0.7 |
| 5.629999999999756 | 0.7 |
| 5.639999999999755 | 0.7 |
| 5.649999999999755 | 0.7 |
| 5.659999999999755 | 0.7 |
| 5.669999999999755 | 0.7 |
| 5.679999999999754 | 0.7 |
| 5.689999999999754 | 0.7 |
| 5.699999999999754 | 0.7 |
| 5.709999999999754 | 0.7 |
| 5.719999999999754 | 0.7 |
| 5.729999999999753 | 0.7 |
| 5.739999999999753 | 0.7 |
| 5.749999999999753 | 0.7 |
| 5.759999999999753 | 0.7 |
| 5.769999999999753 | 0.7 |
| 5.779999999999752 | 0.7 |
| 5.789999999999752 | 0.7 |
| 5.799999999999752 | 0.7 |
| 5.809999999999752 | 0.7 |
| 5.819999999999752 | 0.7 |
| 5.829999999999751 | 0.7 |
| 5.839999999999751 | 0.7 |
| 5.849999999999751 | 0.7 |
| 5.859999999999751 | 0.7 |
| 5.86999999999975 | 0.7 |
| 5.87999999999975 | 0.7 |
| 5.88999999999975 | 0.7 |
| 5.89999999999975 | 0.7 |
| 5.90999999999975 | 0.7 |
| 5.91999999999975 | 0.7 |
| 5.92999999999975 | 0.7 |
| 5.93999999999975 | 0.7 |
| 5.949999999999748 | 0.7 |
| 5.959999999999748 | 0.7 |
| 5.969999999999748 | 0.7 |
| 5.979999999999748 | 0.7 |
| 5.989999999999747 | 0.7 |
| 5.999999999999747 | 0.7 |
| 6.009999999999747 | 0.7 |
| 6.019999999999747 | 0.7 |
| 6.029999999999747 | 0.7 |
| 6.039999999999746 | 0.7 |
| 6.049999999999746 | 0.7 |
| 6.059999999999746 | 0.7 |
| 6.069999999999746 | 0.7 |
| 6.079999999999746 | 0.7 |
| 6.089999999999745 | 0.7 |
| 6.099999999999745 | 0.7 |
| 6.109999999999745 | 0.7 |
| 6.119999999999745 | 0.7 |
| 6.129999999999745 | 0.7 |
| 6.139999999999744 | 0.7 |
| 6.149999999999744 | 0.7 |
| 6.159999999999744 | 0.7 |
| 6.169999999999744 | 0.7 |
| 6.179999999999744 | 0.7 |
| 6.189999999999744 | 0.7 |
| 6.199999999999743 | 0.7 |
| 6.209999999999743 | 0.7 |
| 6.219999999999743 | 0.7 |
| 6.229999999999743 | 0.7 |
| 6.239999999999742 | 0.7 |
| 6.249999999999742 | 0.7 |
| 6.259999999999742 | 0.7 |
| 6.269999999999742 | 0.7 |
| 6.279999999999741 | 0.7 |
| 6.289999999999741 | 0.7 |
| 6.299999999999741 | 0.7 |
| 6.309999999999741 | 0.7 |
| 6.319999999999741 | 0.7 |
| 6.329999999999741 | 0.7 |
| 6.33999999999974 | 0.7 |
| 6.34999999999974 | 0.7 |
| 6.35999999999974 | 0.7 |
| 6.36999999999974 | 0.7 |
| 6.37999999999974 | 0.7 |
| 6.38999999999974 | 0.7 |
| 6.39999999999974 | 0.7 |
| 6.409999999999738 | 0.7 |
| 6.419999999999738 | 0.7 |
| 6.429999999999738 | 0.7 |
| 6.439999999999738 | 0.7 |
| 6.449999999999738 | 0.7 |
| 6.459999999999737 | 0.7 |
| 6.469999999999737 | 0.7 |
| 6.479999999999737 | 0.7 |
| 6.489999999999737 | 0.7 |
| 6.499999999999737 | 0.7 |
| 6.509999999999736 | 0.7 |
| 6.519999999999736 | 0.7 |
| 6.529999999999736 | 0.7 |
| 6.539999999999736 | 0.7 |
| 6.549999999999736 | 0.7 |
| 6.559999999999735 | 0.7 |
| 6.569999999999735 | 0.7 |
| 6.579999999999735 | 0.7 |
| 6.589999999999735 | 0.7 |
| 6.599999999999734 | 0.7 |
| 6.609999999999734 | 0.7 |
| 6.619999999999734 | 0.7 |
| 6.629999999999734 | 0.7 |
| 6.639999999999734 | 0.7 |
| 6.649999999999734 | 0.7 |
| 6.659999999999734 | 0.7 |
| 6.669999999999733 | 0.7 |
| 6.679999999999733 | 0.7 |
| 6.689999999999733 | 0.7 |
| 6.699999999999733 | 0.7 |
| 6.709999999999732 | 0.7 |
| 6.719999999999732 | 0.7 |
| 6.729999999999732 | 0.7 |
| 6.739999999999731 | 0.7 |
| 6.749999999999731 | 0.7 |
| 6.759999999999731 | 0.7 |
| 6.769999999999731 | 0.7 |
| 6.77999999999973 | 0.7 |
| 6.78999999999973 | 0.7 |
| 6.79999999999973 | 0.7 |
| 6.80999999999973 | 0.7 |
| 6.81999999999973 | 0.7 |
| 6.82999999999973 | 0.7 |
| 6.83999999999973 | 0.7 |
| 6.84999999999973 | 0.7 |
| 6.85999999999973 | 0.7 |
| 6.86999999999973 | 0.7 |
| 6.879999999999728 | 0.7 |
| 6.889999999999728 | 0.7 |
| 6.899999999999728 | 0.7 |
| 6.909999999999728 | 0.7 |
| 6.919999999999728 | 0.7 |
| 6.929999999999727 | 0.7 |
| 6.939999999999727 | 0.7 |
| 6.949999999999727 | 0.7 |
| 6.959999999999727 | 0.7 |
| 6.969999999999727 | 0.7 |
| 6.979999999999726 | 0.7 |
| 6.989999999999726 | 0.7 |
| 6.999999999999726 | 0.7 |
| 7.009999999999726 | 0.7 |
| 7.019999999999726 | 0.7 |
| 7.029999999999725 | 0.7 |
| 7.039999999999725 | 0.7 |
| 7.049999999999725 | 0.7 |
| 7.059999999999725 | 0.7 |
| 7.069999999999724 | 0.7 |
| 7.079999999999724 | 0.7 |
| 7.089999999999724 | 0.7 |
| 7.099999999999724 | 0.7 |
| 7.109999999999724 | 0.7 |
| 7.119999999999724 | 0.7 |
| 7.129999999999724 | 0.7 |
| 7.139999999999723 | 0.7 |
| 7.149999999999723 | 0.7 |
| 7.159999999999723 | 0.7 |
| 7.169999999999723 | 0.7 |
| 7.179999999999722 | 0.7 |
| 7.189999999999722 | 0.7 |
| 7.199999999999722 | 0.7 |
| 7.209999999999721 | 0.7 |
| 7.219999999999721 | 0.7 |
| 7.229999999999721 | 0.7 |
| 7.23999999999972 | 0.7 |
| 7.24999999999972 | 0.7 |
| 7.25999999999972 | 0.7 |
| 7.26999999999972 | 0.7 |
| 7.27999999999972 | 0.7 |
| 7.28999999999972 | 0.7 |
| 7.29999999999972 | 0.7 |
| 7.30999999999972 | 0.7 |
| 7.31999999999972 | 0.7 |
| 7.329999999999719 | 0.7 |
| 7.33999999999972 | 0.7 |
| 7.349999999999719 | 0.7 |
| 7.359999999999719 | 0.7 |
| 7.369999999999718 | 0.7 |
| 7.379999999999718 | 0.7 |
| 7.389999999999718 | 0.7 |
| 7.399999999999718 | 0.7 |
| 7.409999999999717 | 0.7 |
| 7.419999999999717 | 0.7 |
| 7.429999999999717 | 0.7 |
| 7.439999999999717 | 0.7 |
| 7.449999999999716 | 0.7 |
| 7.459999999999716 | 0.7 |
| 7.469999999999716 | 0.7 |
| 7.479999999999716 | 0.7 |
| 7.489999999999715 | 0.7 |
| 7.499999999999715 | 0.7 |
| 7.509999999999715 | 0.7 |
| 7.519999999999715 | 0.7 |
| 7.529999999999715 | 0.7 |
| 7.539999999999714 | 0.7 |
| 7.549999999999714 | 0.7 |
| 7.559999999999714 | 0.7 |
| 7.569999999999714 | 0.7 |
| 7.579999999999714 | 0.7 |
| 7.589999999999714 | 0.7 |
| 7.599999999999714 | 0.7 |
| 7.609999999999713 | 0.7 |
| 7.619999999999713 | 0.7 |
| 7.629999999999713 | 0.7 |
| 7.639999999999713 | 0.7 |
| 7.649999999999712 | 0.7 |
| 7.659999999999712 | 0.7 |
| 7.669999999999712 | 0.7 |
| 7.679999999999712 | 0.7 |
| 7.689999999999712 | 0.7 |
| 7.699999999999711 | 0.7 |
| 7.709999999999711 | 0.7 |
| 7.719999999999711 | 0.7 |
| 7.729999999999711 | 0.7 |
| 7.73999999999971 | 0.7 |
| 7.74999999999971 | 0.7 |
| 7.75999999999971 | 0.7 |
| 7.76999999999971 | 0.7 |
| 7.77999999999971 | 0.7 |
| 7.78999999999971 | 0.7 |
| 7.79999999999971 | 0.7 |
| 7.80999999999971 | 0.7 |
| 7.819999999999709 | 0.7 |
| 7.829999999999709 | 0.7 |
| 7.839999999999708 | 0.7 |
| 7.849999999999708 | 0.7 |
| 7.859999999999708 | 0.7 |
| 7.869999999999708 | 0.7 |
| 7.879999999999707 | 0.7 |
| 7.889999999999707 | 0.7 |
| 7.899999999999707 | 0.7 |
| 7.909999999999707 | 0.7 |
| 7.919999999999706 | 0.7 |
| 7.929999999999706 | 0.7 |
| 7.939999999999706 | 0.7 |
| 7.949999999999706 | 0.7 |
| 7.959999999999705 | 0.7 |
| 7.969999999999705 | 0.7 |
| 7.979999999999705 | 0.7 |
| 7.989999999999705 | 0.7 |
| 7.999999999999705 | 0.7 |
| 8.009999999999703 | 0.7 |
| 8.019999999999705 | 0.7 |
| 8.029999999999704 | 0.7 |
| 8.039999999999704 | 0.7 |
| 8.049999999999704 | 0.7 |
| 8.059999999999704 | 0.7 |
| 8.069999999999704 | 0.7 |
| 8.079999999999703 | 0.7 |
| 8.089999999999703 | 0.7 |
| 8.099999999999701 | 0.7 |
| 8.109999999999703 | 0.7 |
| 8.119999999999703 | 0.7 |
| 8.129999999999702 | 0.7 |
| 8.139999999999702 | 0.7 |
| 8.1499999999997 | 0.7 |
| 8.1599999999997 | 0.7 |
| 8.1699999999997 | 0.7 |
| 8.1799999999997 | 0.7 |
| 8.1899999999997 | 0.7 |
| 8.1999999999997 | 0.7 |
| 8.2099999999997 | 0.7 |
| 8.2199999999997 | 0.7 |
| 8.2299999999997 | 0.7 |
| 8.2399999999997 | 0.7 |
| 8.2499999999997 | 0.7 |
| 8.2599999999997 | 0.7 |
| 8.2699999999997 | 0.7 |
| 8.2799999999997 | 0.7 |
| 8.289999999999697 | 0.7 |
| 8.299999999999699 | 0.7 |
| 8.309999999999699 | 0.7 |
| 8.319999999999698 | 0.7 |
| 8.329999999999698 | 0.7 |
| 8.339999999999698 | 0.7 |
| 8.349999999999698 | 0.7 |
| 8.359999999999697 | 0.7 |
| 8.369999999999697 | 0.7 |
| 8.379999999999695 | 0.7 |
| 8.389999999999697 | 0.7 |
| 8.399999999999697 | 0.7 |
| 8.409999999999696 | 0.7 |
| 8.419999999999696 | 0.7 |
| 8.429999999999694 | 0.7 |
| 8.439999999999696 | 0.7 |
| 8.449999999999696 | 0.7 |
| 8.459999999999695 | 0.7 |
| 8.469999999999695 | 0.7 |
| 8.479999999999693 | 0.7 |
| 8.489999999999695 | 0.7 |
| 8.499999999999694 | 0.7 |
| 8.509999999999694 | 0.7 |
| 8.519999999999694 | 0.7 |
| 8.529999999999694 | 0.7 |
| 8.539999999999694 | 0.7 |
| 8.549999999999693 | 0.7 |
| 8.55999999999969 | 0.7 |
| 8.56999999999969 | 0.7 |
| 8.57999999999969 | 0.7 |
| 8.58999999999969 | 0.7 |
| 8.59999999999969 | 0.7 |
| 8.60999999999969 | 0.7 |
| 8.61999999999969 | 0.7 |
| 8.62999999999969 | 0.7 |
| 8.63999999999969 | 0.7 |
| 8.64999999999969 | 0.7 |
| 8.65999999999969 | 0.7 |
| 8.66999999999969 | 0.7 |
| 8.67999999999969 | 0.7 |
| 8.68999999999969 | 0.7 |
| 8.69999999999969 | 0.7 |
| 8.70999999999969 | 0.7 |
| 8.71999999999969 | 0.7 |
| 8.72999999999969 | 0.7 |
| 8.73999999999969 | 0.7 |
| 8.74999999999969 | 0.7 |
| 8.759999999999687 | 0.7 |
| 8.769999999999689 | 0.7 |
| 8.779999999999688 | 0.7 |
| 8.789999999999688 | 0.7 |
| 8.799999999999686 | 0.7 |
| 8.809999999999688 | 0.7 |
| 8.819999999999688 | 0.7 |
| 8.829999999999687 | 0.7 |
| 8.839999999999687 | 0.7 |
| 8.849999999999685 | 0.7 |
| 8.859999999999687 | 0.7 |
| 8.869999999999687 | 0.7 |
| 8.879999999999686 | 0.7 |
| 8.889999999999686 | 0.7 |
| 8.899999999999684 | 0.7 |
| 8.909999999999686 | 0.7 |
| 8.919999999999686 | 0.7 |
| 8.929999999999685 | 0.7 |
| 8.939999999999685 | 0.7 |
| 8.949999999999685 | 0.7 |
| 8.959999999999685 | 0.7 |
| 8.969999999999684 | 0.7 |
| 8.979999999999684 | 0.7 |
| 8.989999999999682 | 0.7 |
| 8.999999999999684 | 0.7 |
| 9.009999999999684 | 0.7 |
| 9.019999999999683 | 0.7 |
| 9.029999999999683 | 0.7 |
| 9.039999999999681 | 0.7 |
| 9.049999999999683 | 0.7 |
| 9.05999999999968 | 0.7 |
| 9.06999999999968 | 0.7 |
| 9.07999999999968 | 0.7 |
| 9.08999999999968 | 0.7 |
| 9.09999999999968 | 0.7 |
| 9.10999999999968 | 0.7 |
| 9.11999999999968 | 0.7 |
| 9.12999999999968 | 0.7 |
| 9.13999999999968 | 0.7 |
| 9.14999999999968 | 0.7 |
| 9.15999999999968 | 0.7 |
| 9.16999999999968 | 0.7 |
| 9.17999999999968 | 0.7 |
| 9.18999999999968 | 0.7 |
| 9.19999999999968 | 0.7 |
| 9.20999999999968 | 0.7 |
| 9.21999999999968 | 0.7 |
| 9.229999999999677 | 0.7 |
| 9.239999999999679 | 0.7 |
| 9.249999999999678 | 0.7 |
| 9.259999999999678 | 0.7 |
| 9.269999999999678 | 0.7 |
| 9.279999999999678 | 0.7 |
| 9.289999999999678 | 0.7 |
| 9.299999999999677 | 0.7 |
| 9.309999999999677 | 0.7 |
| 9.319999999999675 | 0.7 |
| 9.329999999999677 | 0.7 |
| 9.339999999999677 | 0.7 |
| 9.349999999999676 | 0.7 |
| 9.359999999999676 | 0.7 |
| 9.369999999999674 | 0.7 |
| 9.379999999999676 | 0.7 |
| 9.389999999999675 | 0.7 |
| 9.399999999999675 | 0.7 |
| 9.409999999999675 | 0.7 |
| 9.419999999999675 | 0.7 |
| 9.429999999999675 | 0.7 |
| 9.439999999999674 | 0.7 |
| 9.449999999999674 | 0.7 |
| 9.459999999999672 | 0.7 |
| 9.469999999999674 | 0.7 |
| 9.479999999999674 | 0.7 |
| 9.489999999999673 | 0.7 |
| 9.499999999999673 | 0.7 |
| 9.509999999999671 | 0.7 |
| 9.519999999999673 | 0.7 |
| 9.529999999999673 | 0.7 |
| 9.539999999999672 | 0.7 |
| 9.549999999999672 | 0.7 |
| 9.55999999999967 | 0.7 |
| 9.56999999999967 | 0.7 |
| 9.57999999999967 | 0.7 |
| 9.58999999999967 | 0.7 |
| 9.59999999999967 | 0.7 |
| 9.60999999999967 | 0.7 |
| 9.61999999999967 | 0.7 |
| 9.62999999999967 | 0.7 |
| 9.63999999999967 | 0.7 |
| 9.64999999999967 | 0.7 |
| 9.65999999999967 | 0.7 |
| 9.66999999999967 | 0.7 |
| 9.67999999999967 | 0.7 |
| 9.689999999999667 | 0.7 |
| 9.699999999999669 | 0.7 |
| 9.709999999999669 | 0.7 |
| 9.719999999999668 | 0.7 |
| 9.729999999999668 | 0.7 |
| 9.739999999999666 | 0.7 |
| 9.749999999999668 | 0.7 |
| 9.759999999999668 | 0.7 |
| 9.769999999999667 | 0.7 |
| 9.779999999999667 | 0.7 |
| 9.789999999999665 | 0.7 |
| 9.799999999999667 | 0.7 |
| 9.809999999999667 | 0.7 |
| 9.819999999999666 | 0.7 |
| 9.829999999999666 | 0.7 |
| 9.839999999999664 | 0.7 |
| 9.849999999999666 | 0.7 |
| 9.859999999999665 | 0.7 |
| 9.869999999999665 | 0.7 |
| 9.879999999999663 | 0.7 |
| 9.889999999999665 | 0.7 |
| 9.899999999999665 | 0.7 |
| 9.909999999999664 | 0.7 |
| 9.919999999999664 | 0.7 |
| 9.929999999999662 | 0.7 |
| 9.939999999999664 | 0.7 |
| 9.949999999999664 | 0.7 |
| 9.95999999999966 | 0.7 |
| 9.96999999999966 | 0.7 |
| 9.97999999999966 | 0.7 |
| 9.98999999999966 | 0.7 |
| 9.99999999999966 | 0.7 |